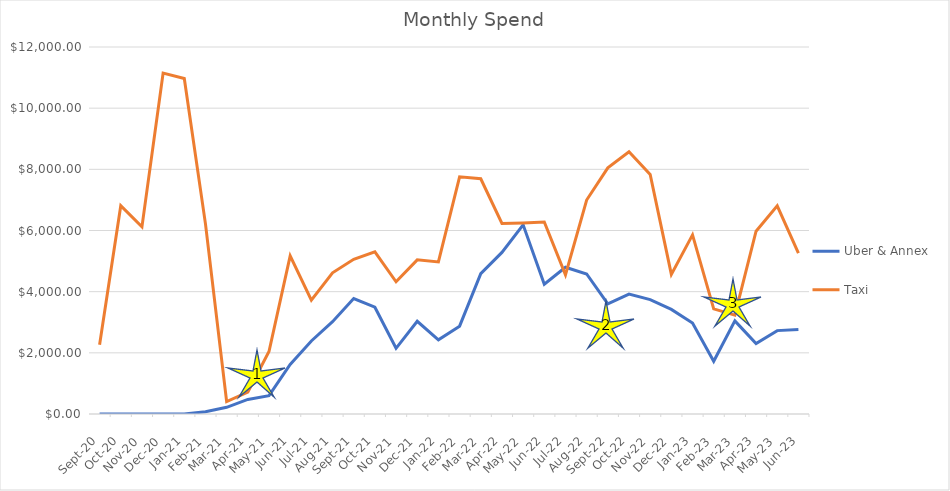
| Category | Uber & Annex | Taxi |
|---|---|---|
| 2020-09-01 | 0 | 2261.5 |
| 2020-10-01 | 0 | 6810.3 |
| 2020-11-01 | 0 | 6119.6 |
| 2020-12-01 | 0 | 11144.6 |
| 2021-01-01 | 0 | 10971.5 |
| 2021-02-01 | 73.1 | 6218 |
| 2021-03-01 | 218.64 | 406.5 |
| 2021-04-01 | 476.11 | 714 |
| 2021-05-01 | 598.13 | 2043 |
| 2021-06-01 | 1618.72 | 5170.3 |
| 2021-07-01 | 2388.37 | 3724.5 |
| 2021-08-01 | 3017.75 | 4617.5 |
| 2021-09-01 | 3774.34 | 5056.5 |
| 2021-10-01 | 3492.27 | 5300.3 |
| 2021-11-01 | 2147.85 | 4323.3 |
| 2021-12-01 | 3032.66 | 5040 |
| 2022-01-01 | 2426.53 | 4973.9 |
| 2022-02-01 | 2872.53 | 7755.5 |
| 2022-03-01 | 4590.11 | 7691.3 |
| 2022-04-01 | 5282.77 | 6230.5 |
| 2022-05-01 | 6185.38 | 6246.1 |
| 2022-06-01 | 4243.07 | 6277 |
| 2022-07-01 | 4798.18 | 4549.4 |
| 2022-08-01 | 4578.69 | 6995.95 |
| 2022-09-01 | 3598.24 | 8047.45 |
| 2022-10-01 | 3921.32 | 8576 |
| 2022-11-01 | 3738.53 | 7833.65 |
| 2022-12-01 | 3419.72 | 4565.3 |
| 2023-01-01 | 2975.65 | 5856.35 |
| 2023-02-01 | 1724.79 | 3438 |
| 2023-03-01 | 3045.43 | 3234.3 |
| 2023-04-01 | 2303.51 | 5977.1 |
| 2023-05-01 | 2726.23 | 6804.05 |
| 2023-06-01 | 2766.79 | 5261.9 |